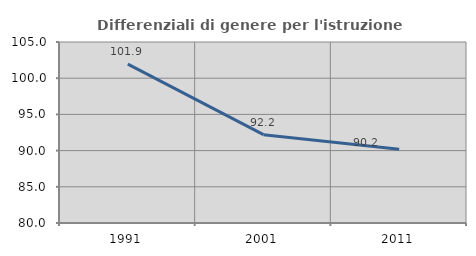
| Category | Differenziali di genere per l'istruzione superiore |
|---|---|
| 1991.0 | 101.937 |
| 2001.0 | 92.198 |
| 2011.0 | 90.193 |